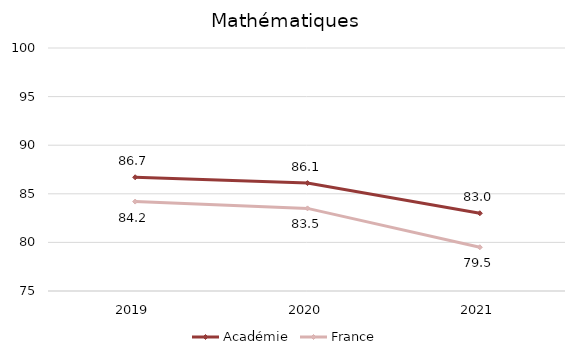
| Category | Académie | France |
|---|---|---|
| 2019.0 | 86.7 | 84.2 |
| 2020.0 | 86.1 | 83.5 |
| 2021.0 | 83 | 79.5 |